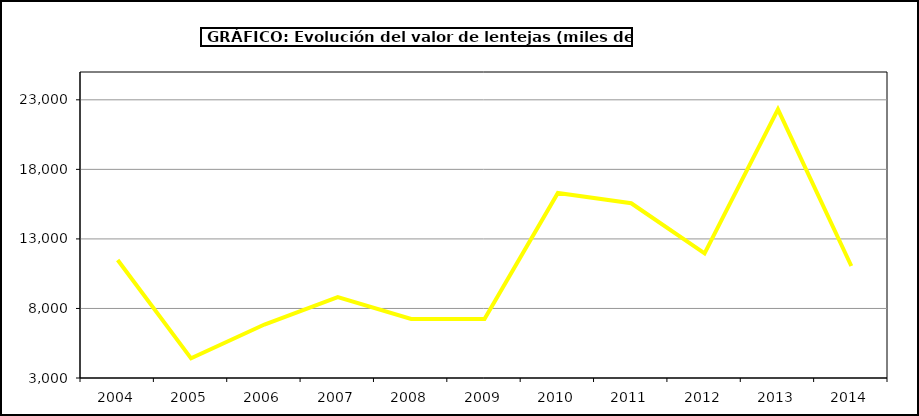
| Category | Valor |
|---|---|
| 2004.0 | 11487.809 |
| 2005.0 | 4411.888 |
| 2006.0 | 6843.6 |
| 2007.0 | 8820.816 |
| 2008.0 | 7246.764 |
| 2009.0 | 7234.01 |
| 2010.0 | 16307.099 |
| 2011.0 | 15562.569 |
| 2012.0 | 11960.065 |
| 2013.0 | 22313.5 |
| 2014.0 | 11051.282 |